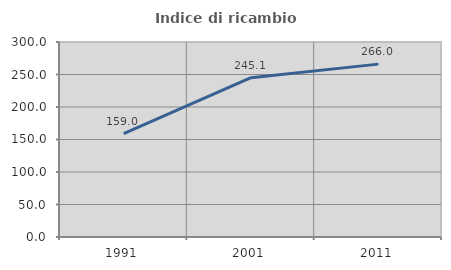
| Category | Indice di ricambio occupazionale  |
|---|---|
| 1991.0 | 158.963 |
| 2001.0 | 245.098 |
| 2011.0 | 265.963 |